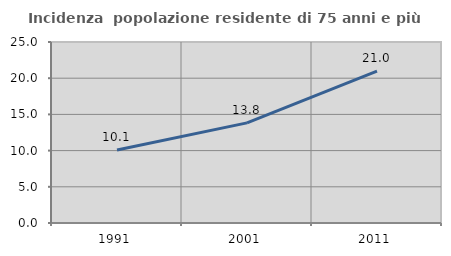
| Category | Incidenza  popolazione residente di 75 anni e più |
|---|---|
| 1991.0 | 10.091 |
| 2001.0 | 13.827 |
| 2011.0 | 20.973 |